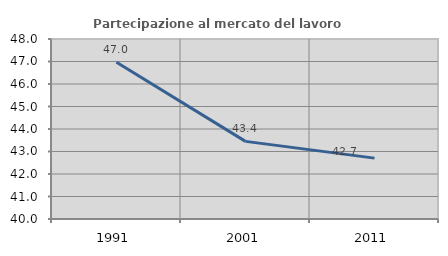
| Category | Partecipazione al mercato del lavoro  femminile |
|---|---|
| 1991.0 | 46.966 |
| 2001.0 | 43.45 |
| 2011.0 | 42.705 |